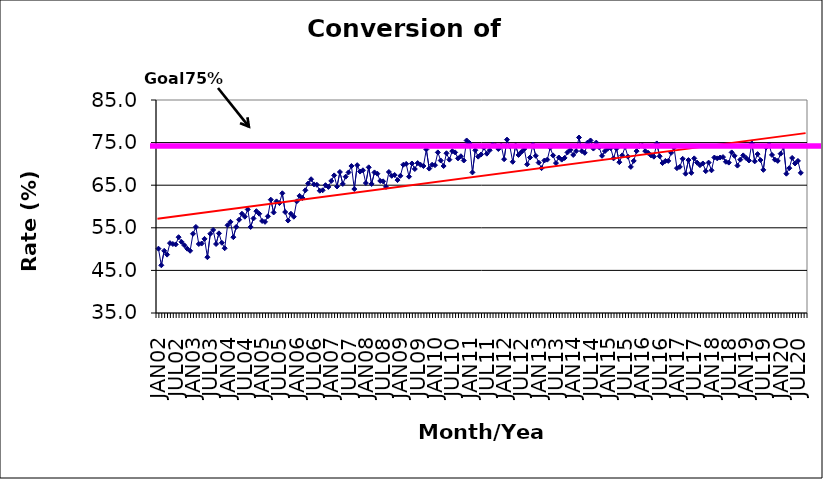
| Category | Series 0 |
|---|---|
| JAN02 | 50.1 |
| FEB02 | 46.2 |
| MAR02 | 49.6 |
| APR02 | 48.7 |
| MAY02 | 51.4 |
| JUN02 | 51.2 |
| JUL02 | 51.1 |
| AUG02 | 52.8 |
| SEP02 | 51.7 |
| OCT02 | 50.9 |
| NOV02 | 50.1 |
| DEC02 | 49.6 |
| JAN03 | 53.6 |
| FEB03 | 55.2 |
| MAR03 | 51.2 |
| APR03 | 51.3 |
| MAY03 | 52.4 |
| JUN03 | 48.1 |
| JUL03 | 53.6 |
| AUG03 | 54.5 |
| SEP03 | 51.2 |
| OCT03 | 53.7 |
| NOV03 | 51.5 |
| DEC03 | 50.2 |
| JAN04 | 55.6 |
| FEB04 | 56.4 |
| MAR04 | 52.8 |
| APR04 | 55.2 |
| MAY04 | 56.9 |
| JUN04 | 58.3 |
| JUL04 | 57.6 |
| AUG04 | 59.3 |
| SEP04 | 55.2 |
| OCT04 | 57.2 |
| NOV04 | 58.9 |
| DEC04 | 58.3 |
| JAN05 | 56.6 |
| FEB05 | 56.4 |
| MAR05 | 57.7 |
| APR05 | 61.6 |
| MAY05 | 58.6 |
| JUN05 | 61.2 |
| JUL05 | 60.8 |
| AUG05 | 63.1 |
| SEP05 | 58.7 |
| OCT05 | 56.7 |
| NOV05 | 58.3 |
| DEC05 | 57.6 |
| JAN06 | 61.2 |
| FEB06 | 62.5 |
| MAR06 | 62 |
| APR06 | 63.8 |
| MAY06 | 65.4 |
| JUN06 | 66.4 |
| JUL06 | 65.2 |
| AUG06 | 65.1 |
| SEP06 | 63.7 |
| OCT06 | 63.8 |
| NOV06 | 65 |
| DEC06 | 64.6 |
| JAN07 | 66 |
| FEB07 | 67.3 |
| MAR07 | 64.7 |
| APR07 | 68.1 |
| MAY07 | 65.3 |
| JUN07 | 67 |
| JUL07 | 68 |
| AUG07 | 69.5 |
| SEP07 | 64.1 |
| OCT07 | 69.7 |
| NOV07 | 68.2 |
| DEC07 | 68.5 |
| JAN08 | 65.5 |
| FEB08 | 69.2 |
| MAR08 | 65.3 |
| APR08 | 68 |
| MAY08 | 67.7 |
| JUN08 | 66 |
| JUL08 | 65.9 |
| AUG08 | 64.6 |
| SEP08 | 68.1 |
| OCT08 | 67.2 |
| NOV08 | 67.4 |
| DEC08 | 66.2 |
| JAN09 | 67.2 |
| FEB09 | 69.8 |
| MAR09 | 70 |
| APR09 | 67 |
| MAY09 | 70.1 |
| JUN09 | 68.8 |
| JUL09 | 70.2 |
| AUG09 | 69.8 |
| SEP09 | 69.5 |
| OCT09 | 73.4 |
| NOV09 | 68.9 |
| DEC09 | 69.8 |
| JAN10 | 69.7 |
| FEB10 | 72.7 |
| MAR10 | 70.8 |
| APR10 | 69.5 |
| MAY10 | 72.5 |
| JUN10 | 71 |
| JUL10 | 73 |
| AUG10 | 72.7 |
| SEP10 | 71.3 |
| OCT10 | 71.8 |
| NOV10 | 70.8 |
| DEC10 | 75.5 |
| JAN11 | 74.9 |
| FEB11 | 68 |
| MAR11 | 73.2 |
| APR11 | 71.7 |
| MAY11 | 72.2 |
| JUN11 | 73.8 |
| JUL11 | 72.4 |
| AUG11 | 73.2 |
| SEP11 | 74.5 |
| OCT11 | 74.3 |
| NOV11 | 73.5 |
| DEC11 | 74.3 |
| JAN12 | 71.1 |
| FEB12 | 75.7 |
| MAR12 | 74.1 |
| APR12 | 70.5 |
| MAY12 | 74.3 |
| JUN12 | 72.1 |
| JUL12 | 72.8 |
| AUG12 | 73.5 |
| SEP12 | 69.9 |
| OCT12 | 71.5 |
| NOV12 | 74.5 |
| DEC12 | 71.9 |
| JAN13 | 70.3 |
| FEB13 | 69 |
| MAR13 | 70.8 |
| APR13 | 71 |
| MAY13 | 73.8 |
| JUN13 | 72 |
| JUL13 | 70.2 |
| AUG13 | 71.5 |
| SEP13 | 71 |
| OCT13 | 71.4 |
| NOV13 | 72.7 |
| DEC13 | 73.3 |
| JAN14 | 72.1 |
| FEB14 | 73 |
| MAR14 | 76.2 |
| APR14 | 73 |
| MAY14 | 72.6 |
| JUN14 | 75 |
| JUL14 | 75.5 |
| AUG14 | 73.6 |
| SEP14 | 75 |
| OCT14 | 73.9 |
| NOV14 | 71.9 |
| DEC14 | 73 |
| JAN15 | 73.6 |
| FEB15 | 73.7 |
| MAR15 | 71.3 |
| APR15 | 73.6 |
| MAY15 | 70.4 |
| JUN15 | 72 |
| JUL15 | 74 |
| AUG15 | 71.7 |
| SEP15 | 69.3 |
| OCT15 | 70.7 |
| NOV15 | 73 |
| DEC15 | 74.2 |
| JAN16 | 74.3 |
| FEB16 | 73 |
| MAR16 | 72.6 |
| APR16 | 72 |
| MAY16 | 71.7 |
| JUN16 | 74.8 |
| JUL16 | 71.8 |
| AUG16 | 70.2 |
| SEP16 | 70.7 |
| OCT16 | 70.7 |
| NOV16 | 72.6 |
| DEC16 | 73.8 |
| JAN17 | 69 |
| FEB17 | 69.3 |
| MAR17 | 71.2 |
| APR17 | 67.7 |
| MAY17 | 70.9 |
| JUN17 | 67.9 |
| JUL17 | 71.3 |
| AUG17 | 70.3 |
| SEP17 | 69.7 |
| OCT17 | 70.1 |
| NOV17 | 68.3 |
| DEC17 | 70.3 |
| JAN18 | 68.5 |
| FEB18 | 71.5 |
| MAR18 | 71.3 |
| APR18 | 71.5 |
| MAY18 | 71.6 |
| JUN18 | 70.5 |
| JUL18 | 70.3 |
| AUG18 | 72.7 |
| SEP18 | 71.9 |
| OCT18 | 69.6 |
| NOV18 | 71 |
| DEC18 | 72 |
| JAN19 | 71.4 |
| FEB19 | 70.8 |
| MAR19 | 74.8 |
| APR19 | 70.6 |
| MAY19 | 72.3 |
| JUN19 | 70.9 |
| JUL19 | 68.6 |
| AUG19 | 73.9 |
| SEP19 | 74.5 |
| OCT19 | 72.1 |
| NOV19 | 71 |
| DEC19 | 70.7 |
| JAN20 | 72.4 |
| FEB20 | 74.1 |
| MAR20 | 67.7 |
| APR20 | 69 |
| MAY20 | 71.4 |
| JUN20 | 70.1 |
| JUL20 | 70.7 |
| AUG20 | 67.9 |